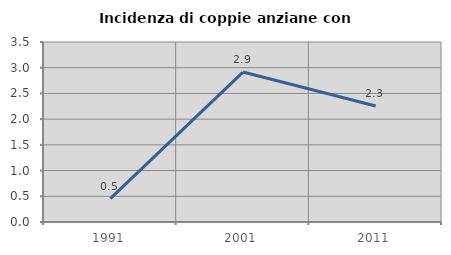
| Category | Incidenza di coppie anziane con figli |
|---|---|
| 1991.0 | 0.455 |
| 2001.0 | 2.915 |
| 2011.0 | 2.254 |